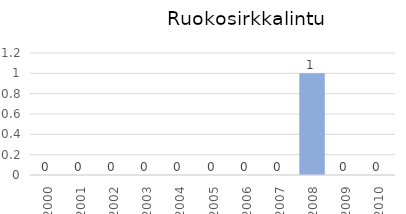
| Category | Series 0 |
|---|---|
| 2000.0 | 0 |
| 2001.0 | 0 |
| 2002.0 | 0 |
| 2003.0 | 0 |
| 2004.0 | 0 |
| 2005.0 | 0 |
| 2006.0 | 0 |
| 2007.0 | 0 |
| 2008.0 | 1 |
| 2009.0 | 0 |
| 2010.0 | 0 |